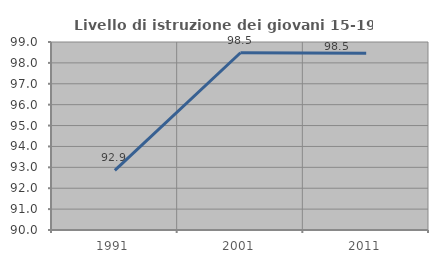
| Category | Livello di istruzione dei giovani 15-19 anni |
|---|---|
| 1991.0 | 92.857 |
| 2001.0 | 98.485 |
| 2011.0 | 98.462 |